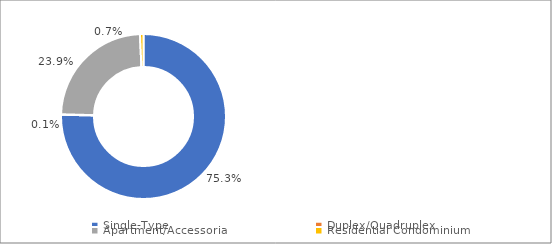
| Category | Series 0 |
|---|---|
| Single-Type | 0.753 |
| Duplex/Quadruplex | 0.001 |
| Apartment/Accessoria | 0.239 |
| Residential Condominium | 0.007 |